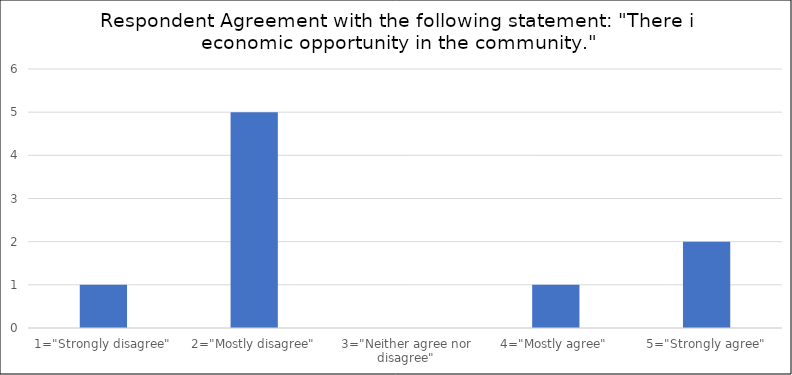
| Category | Number of Responses |
|---|---|
| 1="Strongly disagree" | 1 |
| 2="Mostly disagree" | 5 |
| 3="Neither agree nor disagree" | 0 |
| 4="Mostly agree" | 1 |
| 5="Strongly agree" | 2 |